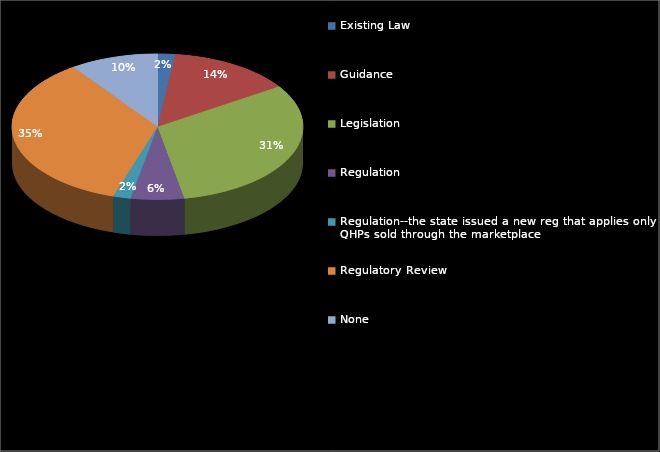
| Category | Series 0 |
|---|---|
| Existing Law | 1 |
| Guidance | 7 |
| Legislation | 16 |
| Regulation | 3 |
| Regulation--the state issued a new reg that applies only to QHPs sold through the marketplace | 1 |
| Regulatory Review | 18 |
| None | 5 |